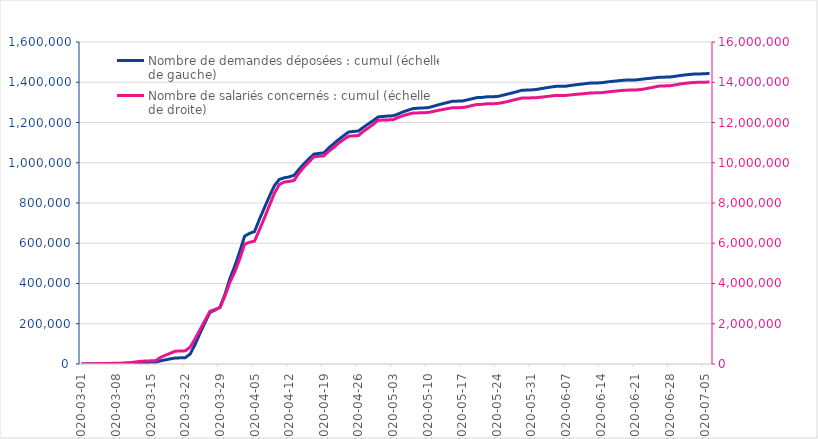
| Category | Nombre de demandes déposées : cumul (échelle de gauche) |
|---|---|
| 2020-03-01 | 1 |
| 2020-03-02 | 124 |
| 2020-03-03 | 289 |
| 2020-03-04 | 490 |
| 2020-03-05 | 794 |
| 2020-03-06 | 1271 |
| 2020-03-07 | 1296 |
| 2020-03-08 | 1313 |
| 2020-03-09 | 1942 |
| 2020-03-10 | 2793 |
| 2020-03-11 | 3904 |
| 2020-03-12 | 5452 |
| 2020-03-13 | 7225 |
| 2020-03-14 | 7691 |
| 2020-03-15 | 8341 |
| 2020-03-16 | 8666 |
| 2020-03-17 | 16132 |
| 2020-03-18 | 20669 |
| 2020-03-19 | 25691 |
| 2020-03-20 | 29919 |
| 2020-03-21 | 30567 |
| 2020-03-22 | 31381 |
| 2020-03-23 | 50353 |
| 2020-03-24 | 98496 |
| 2020-03-25 | 154314 |
| 2020-03-26 | 207059 |
| 2020-03-27 | 256411 |
| 2020-03-28 | 268024 |
| 2020-03-29 | 282179 |
| 2020-03-30 | 345344 |
| 2020-03-31 | 423880 |
| 2020-04-01 | 486279 |
| 2020-04-02 | 558707 |
| 2020-04-03 | 635509 |
| 2020-04-04 | 649186 |
| 2020-04-05 | 658378 |
| 2020-04-06 | 719974 |
| 2020-04-07 | 776793 |
| 2020-04-08 | 833033 |
| 2020-04-09 | 885718 |
| 2020-04-10 | 917164 |
| 2020-04-11 | 925358 |
| 2020-04-12 | 929540 |
| 2020-04-13 | 937742 |
| 2020-04-14 | 967801 |
| 2020-04-15 | 995237 |
| 2020-04-16 | 1019475 |
| 2020-04-17 | 1042771 |
| 2020-04-18 | 1046425 |
| 2020-04-19 | 1049152 |
| 2020-04-20 | 1073310 |
| 2020-04-21 | 1094318 |
| 2020-04-22 | 1115376 |
| 2020-04-23 | 1134101 |
| 2020-04-24 | 1152564 |
| 2020-04-25 | 1155541 |
| 2020-04-26 | 1157529 |
| 2020-04-27 | 1176094 |
| 2020-04-28 | 1193003 |
| 2020-04-29 | 1209764 |
| 2020-04-30 | 1227613 |
| 2020-05-01 | 1230225 |
| 2020-05-02 | 1231975 |
| 2020-05-03 | 1233375 |
| 2020-05-04 | 1241819 |
| 2020-05-05 | 1252488 |
| 2020-05-06 | 1260885 |
| 2020-05-07 | 1268846 |
| 2020-05-08 | 1271043 |
| 2020-05-09 | 1272347 |
| 2020-05-10 | 1273212 |
| 2020-05-11 | 1279627 |
| 2020-05-12 | 1286639 |
| 2020-05-13 | 1293251 |
| 2020-05-14 | 1299304 |
| 2020-05-15 | 1305403 |
| 2020-05-16 | 1306206 |
| 2020-05-17 | 1306781 |
| 2020-05-18 | 1312178 |
| 2020-05-19 | 1318064 |
| 2020-05-20 | 1323774 |
| 2020-05-21 | 1324635 |
| 2020-05-22 | 1327560 |
| 2020-05-23 | 1328249 |
| 2020-05-24 | 1328769 |
| 2020-05-25 | 1334222 |
| 2020-05-26 | 1340384 |
| 2020-05-27 | 1346341 |
| 2020-05-28 | 1352639 |
| 2020-05-29 | 1359983 |
| 2020-05-30 | 1361110 |
| 2020-05-31 | 1362054 |
| 2020-06-01 | 1364106 |
| 2020-06-02 | 1368634 |
| 2020-06-03 | 1372570 |
| 2020-06-04 | 1376436 |
| 2020-06-05 | 1379658 |
| 2020-06-06 | 1380182 |
| 2020-06-07 | 1380661 |
| 2020-06-08 | 1384286 |
| 2020-06-09 | 1387564 |
| 2020-06-10 | 1390373 |
| 2020-06-11 | 1393280 |
| 2020-06-12 | 1396143 |
| 2020-06-13 | 1396548 |
| 2020-06-14 | 1397165 |
| 2020-06-15 | 1400475 |
| 2020-06-16 | 1403484 |
| 2020-06-17 | 1405961 |
| 2020-06-18 | 1408583 |
| 2020-06-19 | 1410761 |
| 2020-06-20 | 1411076 |
| 2020-06-21 | 1411483 |
| 2020-06-22 | 1414202 |
| 2020-06-23 | 1417127 |
| 2020-06-24 | 1419602 |
| 2020-06-25 | 1422344 |
| 2020-06-26 | 1425227 |
| 2020-06-27 | 1425437 |
| 2020-06-28 | 1426063 |
| 2020-06-29 | 1429274 |
| 2020-06-30 | 1433251 |
| 2020-07-01 | 1436294 |
| 2020-07-02 | 1438867 |
| 2020-07-03 | 1441071 |
| 2020-07-04 | 1441459 |
| 2020-07-05 | 1441945 |
| 2020-07-06 | 1444397 |